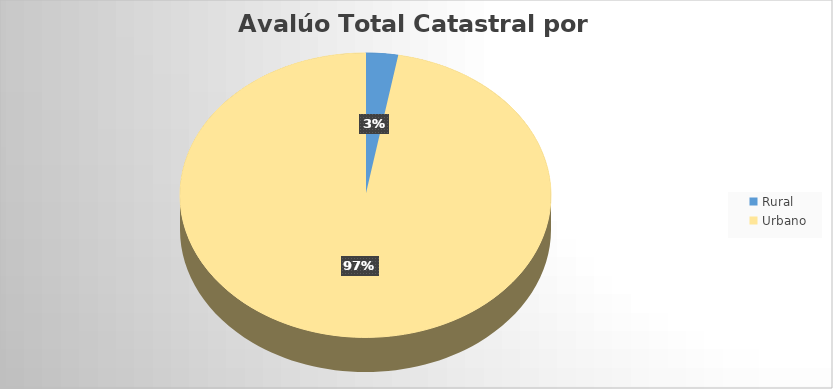
| Category | AvalúoTotal |
|---|---|
| Rural | 2787881455568 |
| Urbano | 96042328951240 |